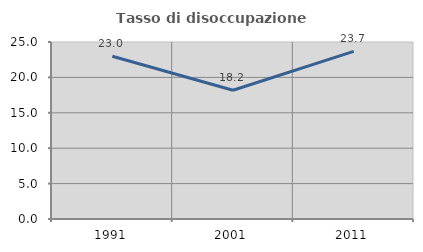
| Category | Tasso di disoccupazione giovanile  |
|---|---|
| 1991.0 | 22.985 |
| 2001.0 | 18.182 |
| 2011.0 | 23.684 |